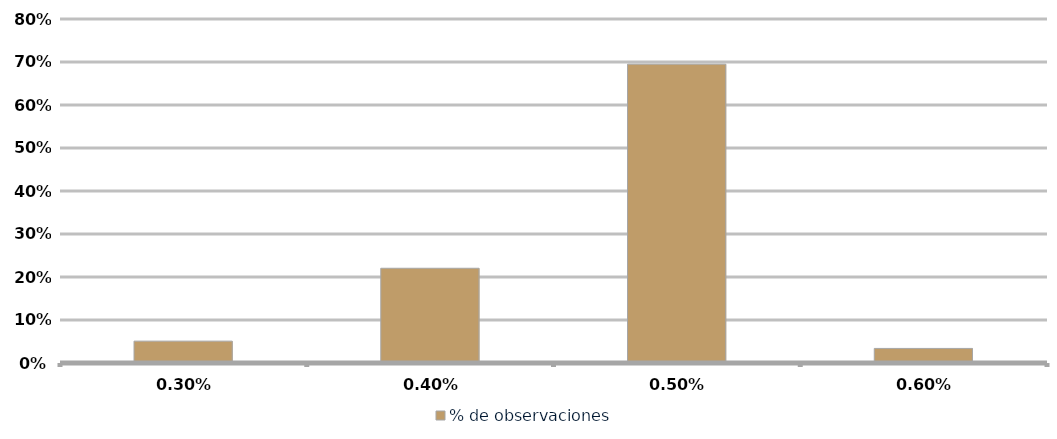
| Category | % de observaciones  |
|---|---|
| 0.003 | 0.051 |
| 0.004 | 0.22 |
| 0.005 | 0.695 |
| 0.006 | 0.034 |